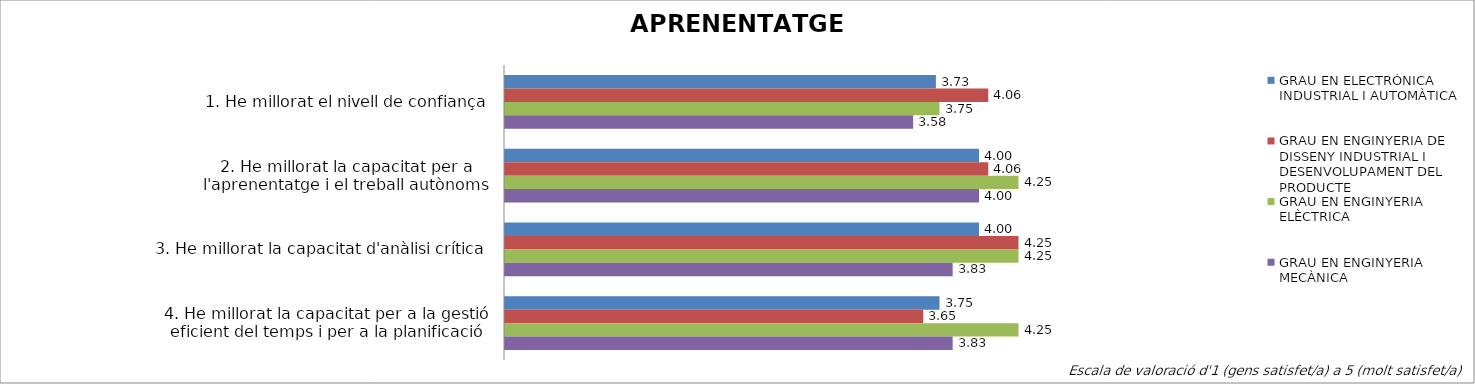
| Category | GRAU EN ELECTRÒNICA INDUSTRIAL I AUTOMÀTICA | GRAU EN ENGINYERIA DE DISSENY INDUSTRIAL I DESENVOLUPAMENT DEL PRODUCTE | GRAU EN ENGINYERIA ELÈCTRICA | GRAU EN ENGINYERIA MECÀNICA |
|---|---|---|---|---|
| 1. He millorat el nivell de confiança | 3.727 | 4.059 | 3.75 | 3.583 |
| 2. He millorat la capacitat per a l'aprenentatge i el treball autònoms | 4 | 4.059 | 4.25 | 4 |
| 3. He millorat la capacitat d'anàlisi crítica | 4 | 4.25 | 4.25 | 3.833 |
| 4. He millorat la capacitat per a la gestió eficient del temps i per a la planificació | 3.75 | 3.647 | 4.25 | 3.833 |